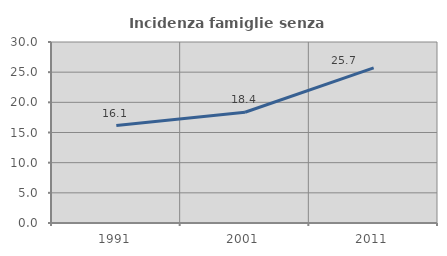
| Category | Incidenza famiglie senza nuclei |
|---|---|
| 1991.0 | 16.145 |
| 2001.0 | 18.363 |
| 2011.0 | 25.724 |